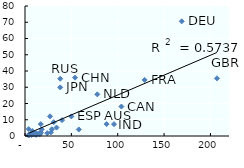
| Category | top site |
|---|---|
| 169.0 | 70587 |
| 54.0 | 35908 |
| 207.0 | 35500 |
| 38.0 | 35245 |
| 129.0 | 34498 |
| 38.0 | 29898 |
| 78.0 | 25632 |
| 104.0 | 18116 |
| 27.0 | 12109 |
| 50.0 | 12062 |
| 40.0 | 9764 |
| 31.0 | 8498 |
| 17.0 | 7319 |
| 88.0 | 7299 |
| 96.0 | 7254 |
| 34.0 | 5201 |
| 4.0 | 4252 |
| 29.0 | 4170 |
| 18.0 | 4109 |
| 58.0 | 4014 |
| 8.0 | 3044 |
| 17.0 | 2351 |
| 28.0 | 2275 |
| 17.0 | 1961 |
| nan | 1775 |
| 24.0 | 1757 |
| 12.0 | 1687 |
| 14.0 | 1372 |
| 8.0 | 1156 |
| 16.0 | 1040 |
| 10.0 | 914 |
| 7.0 | 859 |
| 4.0 | 839 |
| 12.0 | 665 |
| 7.0 | 657 |
| 4.0 | 319 |